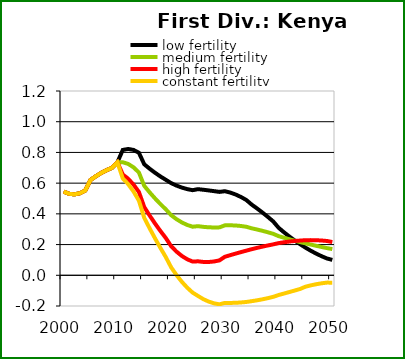
| Category | low fertility | medium fertility | high fertility | constant fertility |
|---|---|---|---|---|
| 2000.0 | 0.545 | 0.545 | 0.545 | 0.545 |
| 2001.0 | 0.531 | 0.531 | 0.531 | 0.531 |
| 2002.0 | 0.527 | 0.527 | 0.527 | 0.527 |
| 2003.0 | 0.534 | 0.534 | 0.534 | 0.534 |
| 2004.0 | 0.551 | 0.551 | 0.551 | 0.551 |
| 2005.0 | 0.621 | 0.621 | 0.621 | 0.621 |
| 2006.0 | 0.645 | 0.645 | 0.645 | 0.645 |
| 2007.0 | 0.667 | 0.667 | 0.667 | 0.667 |
| 2008.0 | 0.685 | 0.685 | 0.685 | 0.685 |
| 2009.0 | 0.7 | 0.7 | 0.7 | 0.7 |
| 2010.0 | 0.736 | 0.736 | 0.736 | 0.736 |
| 2011.0 | 0.816 | 0.736 | 0.656 | 0.631 |
| 2012.0 | 0.822 | 0.725 | 0.629 | 0.594 |
| 2013.0 | 0.816 | 0.703 | 0.591 | 0.545 |
| 2014.0 | 0.798 | 0.669 | 0.542 | 0.486 |
| 2015.0 | 0.723 | 0.582 | 0.444 | 0.373 |
| 2016.0 | 0.694 | 0.54 | 0.389 | 0.306 |
| 2017.0 | 0.668 | 0.501 | 0.337 | 0.241 |
| 2018.0 | 0.644 | 0.464 | 0.288 | 0.178 |
| 2019.0 | 0.622 | 0.43 | 0.243 | 0.119 |
| 2020.0 | 0.6 | 0.392 | 0.19 | 0.052 |
| 2021.0 | 0.584 | 0.365 | 0.154 | 0.002 |
| 2022.0 | 0.571 | 0.344 | 0.126 | -0.043 |
| 2023.0 | 0.561 | 0.328 | 0.104 | -0.081 |
| 2024.0 | 0.554 | 0.316 | 0.089 | -0.113 |
| 2025.0 | 0.561 | 0.32 | 0.091 | -0.135 |
| 2026.0 | 0.557 | 0.315 | 0.087 | -0.155 |
| 2027.0 | 0.553 | 0.313 | 0.087 | -0.172 |
| 2028.0 | 0.548 | 0.311 | 0.09 | -0.183 |
| 2029.0 | 0.543 | 0.312 | 0.097 | -0.189 |
| 2030.0 | 0.548 | 0.325 | 0.12 | -0.18 |
| 2031.0 | 0.539 | 0.326 | 0.131 | -0.18 |
| 2032.0 | 0.526 | 0.324 | 0.141 | -0.179 |
| 2033.0 | 0.51 | 0.321 | 0.151 | -0.177 |
| 2034.0 | 0.49 | 0.316 | 0.16 | -0.174 |
| 2035.0 | 0.46 | 0.306 | 0.17 | -0.168 |
| 2036.0 | 0.435 | 0.298 | 0.179 | -0.163 |
| 2037.0 | 0.408 | 0.29 | 0.187 | -0.156 |
| 2038.0 | 0.38 | 0.28 | 0.194 | -0.149 |
| 2039.0 | 0.351 | 0.27 | 0.201 | -0.14 |
| 2040.0 | 0.309 | 0.255 | 0.209 | -0.128 |
| 2041.0 | 0.28 | 0.245 | 0.215 | -0.119 |
| 2042.0 | 0.252 | 0.235 | 0.22 | -0.109 |
| 2043.0 | 0.227 | 0.225 | 0.223 | -0.099 |
| 2044.0 | 0.203 | 0.216 | 0.226 | -0.089 |
| 2045.0 | 0.18 | 0.208 | 0.228 | -0.074 |
| 2046.0 | 0.16 | 0.2 | 0.229 | -0.066 |
| 2047.0 | 0.141 | 0.192 | 0.228 | -0.058 |
| 2048.0 | 0.124 | 0.184 | 0.226 | -0.052 |
| 2049.0 | 0.109 | 0.177 | 0.223 | -0.048 |
| 2050.0 | 0.1 | 0.171 | 0.217 | -0.048 |